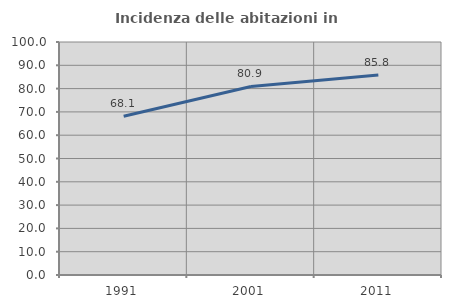
| Category | Incidenza delle abitazioni in proprietà  |
|---|---|
| 1991.0 | 68.108 |
| 2001.0 | 80.911 |
| 2011.0 | 85.801 |